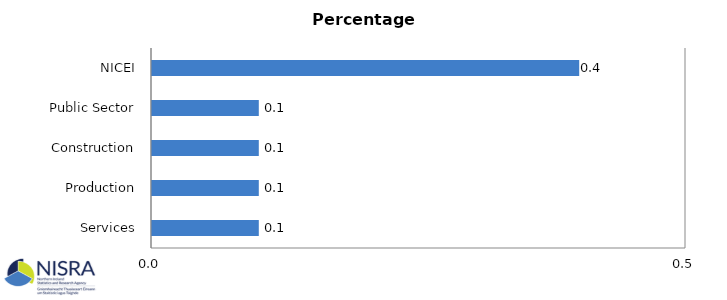
| Category | Percentage Points |
|---|---|
| Services | 0.1 |
| Production | 0.1 |
| Construction | 0.1 |
| Public Sector | 0.1 |
| NICEI | 0.4 |